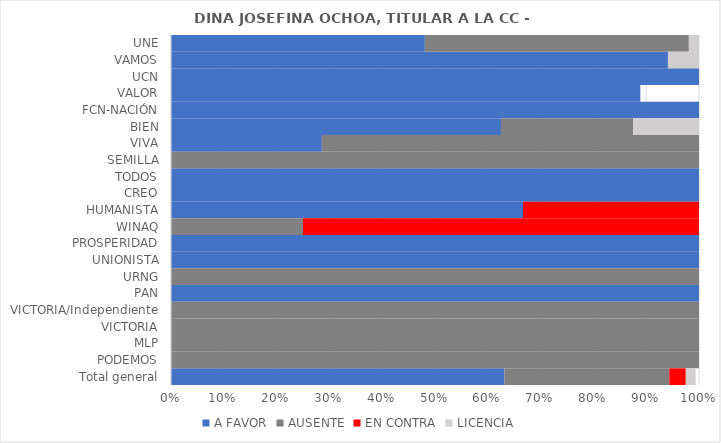
| Category | A FAVOR | AUSENTE | EN CONTRA | LICENCIA |
|---|---|---|---|---|
| UNE | 0.481 | 0.5 | 0 | 0.019 |
| VAMOS | 0.941 | 0 | 0 | 0.059 |
| UCN | 1 | 0 | 0 | 0 |
| VALOR | 0.889 | 0 | 0 | 0 |
| FCN-NACIÓN | 1 | 0 | 0 | 0 |
| BIEN | 0.625 | 0.25 | 0 | 0.125 |
| VIVA | 0.286 | 0.714 | 0 | 0 |
| SEMILLA | 0 | 1 | 0 | 0 |
| TODOS | 1 | 0 | 0 | 0 |
| CREO | 1 | 0 | 0 | 0 |
| HUMANISTA | 0.667 | 0 | 0.333 | 0 |
| WINAQ | 0 | 0.25 | 0.75 | 0 |
| PROSPERIDAD | 1 | 0 | 0 | 0 |
| UNIONISTA | 1 | 0 | 0 | 0 |
| URNG | 0 | 1 | 0 | 0 |
| PAN | 1 | 0 | 0 | 0 |
| VICTORIA/Independiente | 0 | 1 | 0 | 0 |
| VICTORIA | 0 | 1 | 0 | 0 |
| MLP | 0 | 1 | 0 | 0 |
| PODEMOS | 0 | 1 | 0 | 0 |
| Total general | 0.631 | 0.312 | 0.031 | 0.019 |